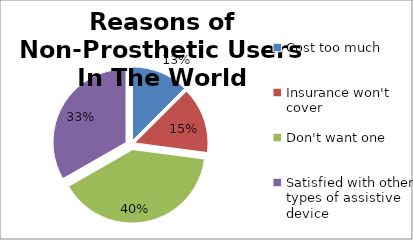
| Category | Percentage |
|---|---|
| Cost too much | 0.125 |
| Insurance won't cover | 0.146 |
| Don't want one | 0.396 |
| Satisfied with other types of assistive device | 0.333 |